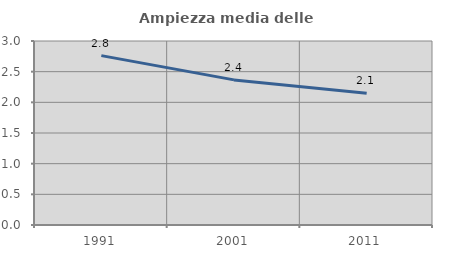
| Category | Ampiezza media delle famiglie |
|---|---|
| 1991.0 | 2.761 |
| 2001.0 | 2.366 |
| 2011.0 | 2.148 |